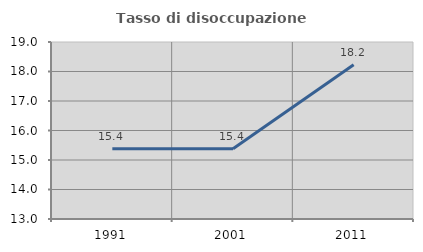
| Category | Tasso di disoccupazione giovanile  |
|---|---|
| 1991.0 | 15.385 |
| 2001.0 | 15.385 |
| 2011.0 | 18.229 |